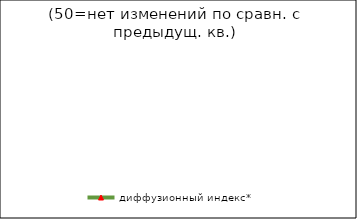
| Category | диффузионный индекс* |
|---|---|
| 2008-2 | 50.48 |
| 2008-3 | 51.275 |
| 2008-4 | 49.67 |
| 2009-1 | 49.375 |
| 2009-2 болжам | 49.595 |